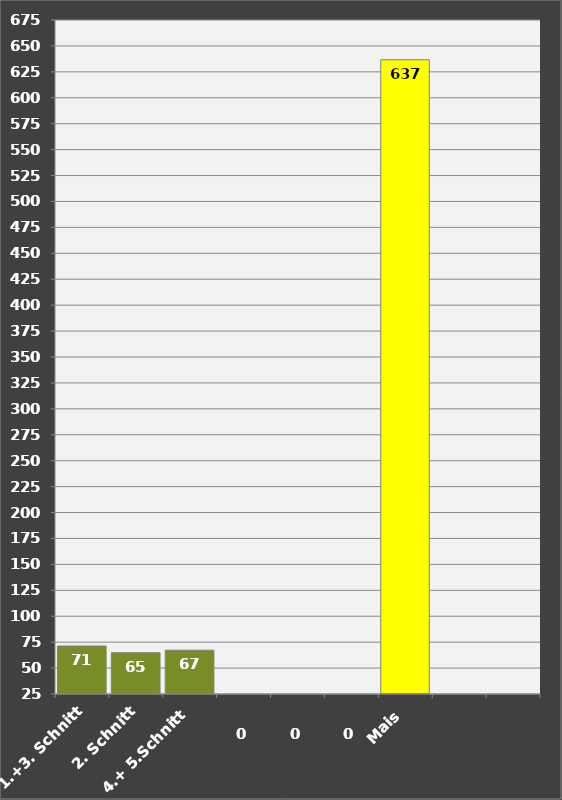
| Category | Ertrag |
|---|---|
| 1.+3. Schnitt | 1900-03-11 06:43:12 |
| 2. Schnitt | 1900-03-04 19:12:00 |
| 4.+ 5.Schnitt | 1900-03-07 06:36:00 |
|  | 0 |
|  | 0 |
|  | 0 |
| Mais | 1901-09-27 14:56:56 |